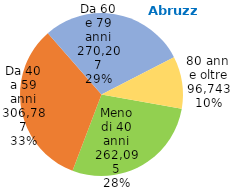
| Category | Series 0 |
|---|---|
| Meno di 40 anni | 262095 |
| Da 40 a 59 anni | 306787 |
| Da 60 e 79 anni | 270207 |
| 80 anni e oltre | 96743 |